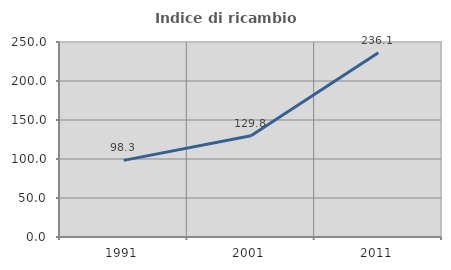
| Category | Indice di ricambio occupazionale  |
|---|---|
| 1991.0 | 98.271 |
| 2001.0 | 129.838 |
| 2011.0 | 236.127 |